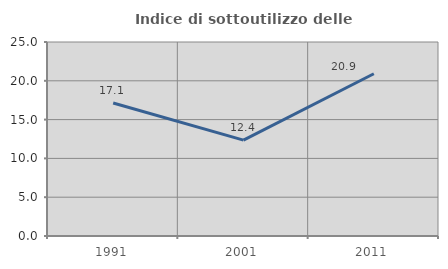
| Category | Indice di sottoutilizzo delle abitazioni  |
|---|---|
| 1991.0 | 17.143 |
| 2001.0 | 12.36 |
| 2011.0 | 20.904 |